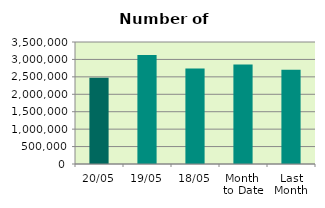
| Category | Series 0 |
|---|---|
| 20/05 | 2473240 |
| 19/05 | 3125944 |
| 18/05 | 2741858 |
| Month 
to Date | 2854937.143 |
| Last
Month | 2707305.9 |